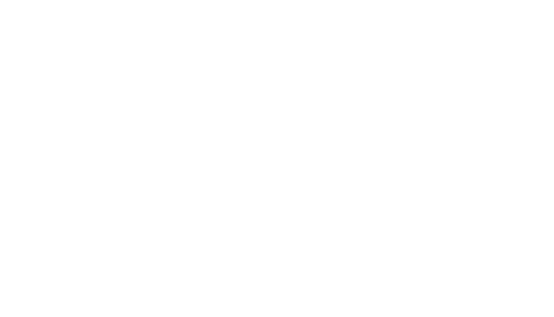
| Category | Series 0 |
|---|---|
| INVESTIMENTOS | 0 |
| PATRIMÔNIO | 0 |
| DISPONÍVEL | 0 |
| CONTAS A RECEBER | 0 |
| CONTAS A PAGAR | 0 |